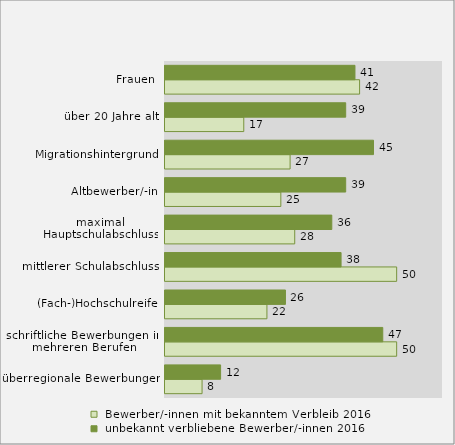
| Category |  Bewerber/-innen mit bekanntem Verbleib 2016 |  unbekannt verbliebene Bewerber/-innen 2016 |
|---|---|---|
| überregionale Bewerbungen | 8 | 12 |
| schriftliche Bewerbungen in mehreren Berufen | 50 | 47 |
| (Fach-)Hochschulreife | 22 | 26 |
| mittlerer Schulabschluss | 50 | 38 |
| maximal Hauptschulabschluss | 28 | 36 |
| Altbewerber/-in | 25 | 39 |
| Migrationshintergrund | 27 | 45 |
| über 20 Jahre alt | 17 | 39 |
| Frauen | 42 | 41 |